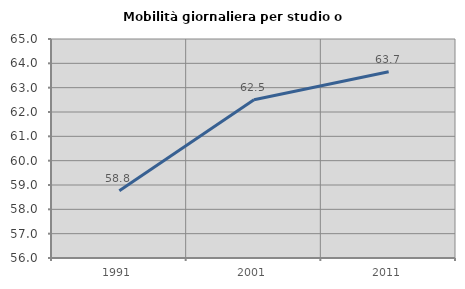
| Category | Mobilità giornaliera per studio o lavoro |
|---|---|
| 1991.0 | 58.765 |
| 2001.0 | 62.5 |
| 2011.0 | 63.652 |